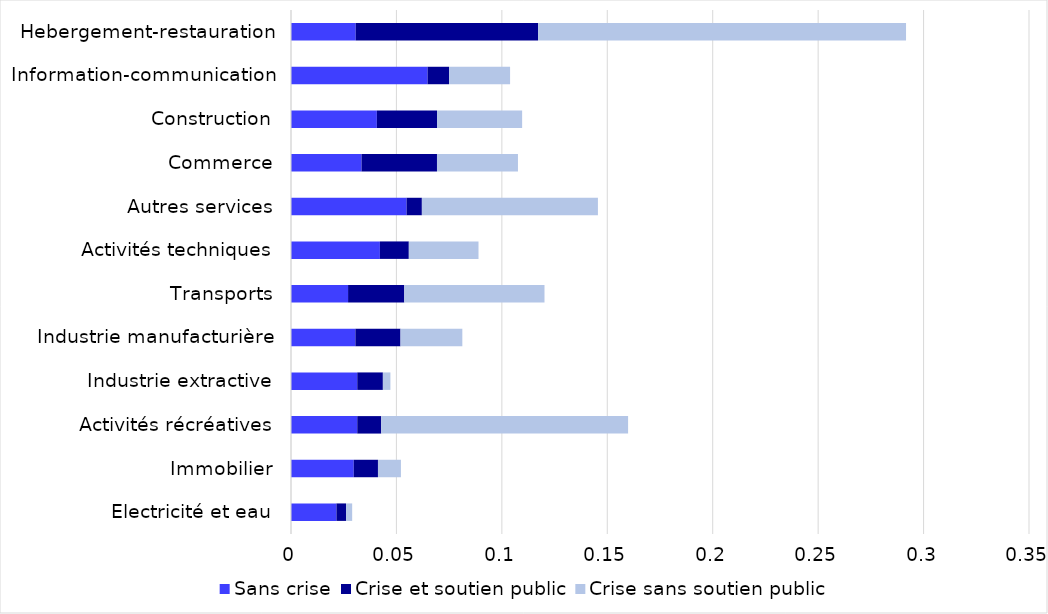
| Category | Sans crise | Crise et soutien public | Crise sans soutien public |
|---|---|---|---|
| Electricité et eau | 0.022 | 0.005 | 0.003 |
| Immobilier | 0.03 | 0.011 | 0.011 |
| Activités récréatives | 0.031 | 0.011 | 0.117 |
| Industrie extractive | 0.031 | 0.012 | 0.004 |
| Industrie manufacturière | 0.031 | 0.021 | 0.029 |
| Transports | 0.027 | 0.027 | 0.066 |
| Activités techniques | 0.042 | 0.014 | 0.033 |
| Autres services | 0.055 | 0.007 | 0.083 |
| Commerce | 0.033 | 0.036 | 0.038 |
| Construction | 0.041 | 0.029 | 0.04 |
| Information-communication | 0.065 | 0.01 | 0.029 |
| Hebergement-restauration | 0.031 | 0.086 | 0.175 |